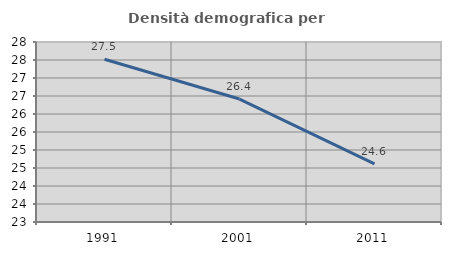
| Category | Densità demografica |
|---|---|
| 1991.0 | 27.522 |
| 2001.0 | 26.415 |
| 2011.0 | 24.617 |